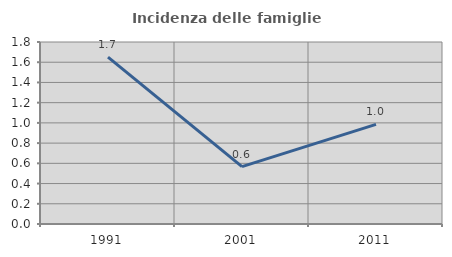
| Category | Incidenza delle famiglie numerose |
|---|---|
| 1991.0 | 1.65 |
| 2001.0 | 0.567 |
| 2011.0 | 0.985 |